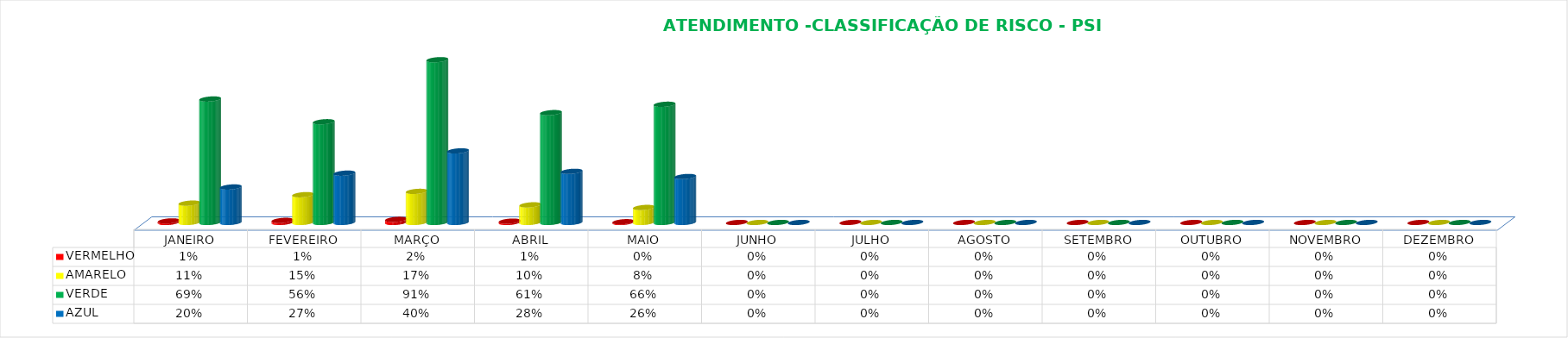
| Category | VERMELHO | AMARELO | VERDE | AZUL |
|---|---|---|---|---|
| JANEIRO | 0.009 | 0.107 | 0.687 | 0.197 |
| FEVEREIRO | 0.011 | 0.154 | 0.56 | 0.274 |
| MARÇO | 0.017 | 0.173 | 0.905 | 0.398 |
| ABRIL | 0.007 | 0.098 | 0.611 | 0.284 |
| MAIO | 0.004 | 0.083 | 0.657 | 0.255 |
| JUNHO | 0 | 0 | 0 | 0 |
| JULHO | 0 | 0 | 0 | 0 |
| AGOSTO | 0 | 0 | 0 | 0 |
| SETEMBRO | 0 | 0 | 0 | 0 |
| OUTUBRO | 0 | 0 | 0 | 0 |
| NOVEMBRO | 0 | 0 | 0 | 0 |
| DEZEMBRO | 0 | 0 | 0 | 0 |